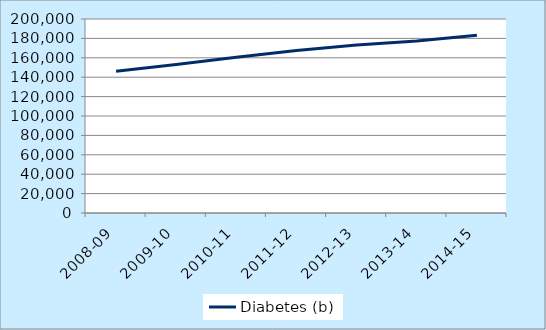
| Category | Diabetes (b) |
|---|---|
| 2008-09 | 146173 |
| 2009-10 | 153175 |
| 2010-11 | 160533 |
| 2011-12 | 167537 |
| 2012-13 | 173299 |
| 2013-14 | 177212 |
| 2014-15 | 183348 |